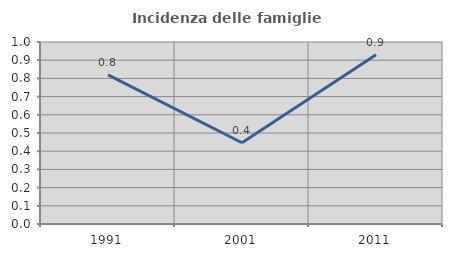
| Category | Incidenza delle famiglie numerose |
|---|---|
| 1991.0 | 0.82 |
| 2001.0 | 0.446 |
| 2011.0 | 0.93 |